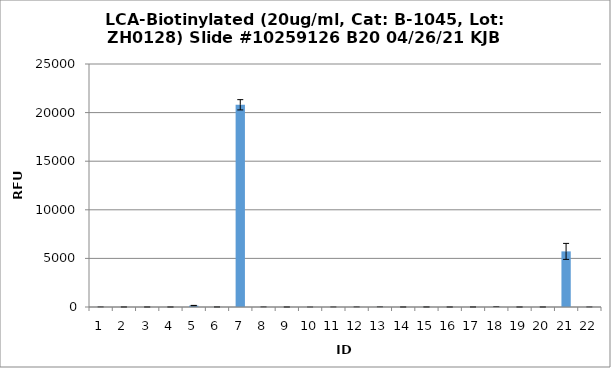
| Category | Series 0 |
|---|---|
| 0 | 4.25 |
| 1 | 3.5 |
| 2 | 2 |
| 3 | 1.25 |
| 4 | 144.5 |
| 5 | 5.5 |
| 6 | 20803.5 |
| 7 | 6.25 |
| 8 | 2 |
| 9 | 0.25 |
| 10 | 2.25 |
| 11 | 5 |
| 12 | 7 |
| 13 | 1 |
| 14 | 5.25 |
| 15 | 1.5 |
| 16 | 3.25 |
| 17 | 13 |
| 18 | 1 |
| 19 | 1.75 |
| 20 | 5721.25 |
| 21 | 3.5 |